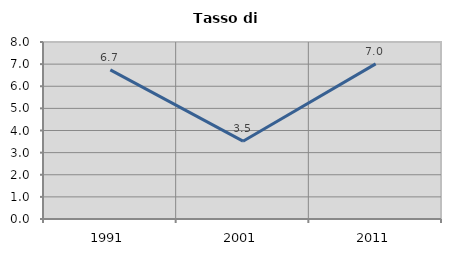
| Category | Tasso di disoccupazione   |
|---|---|
| 1991.0 | 6.74 |
| 2001.0 | 3.517 |
| 2011.0 | 7.011 |